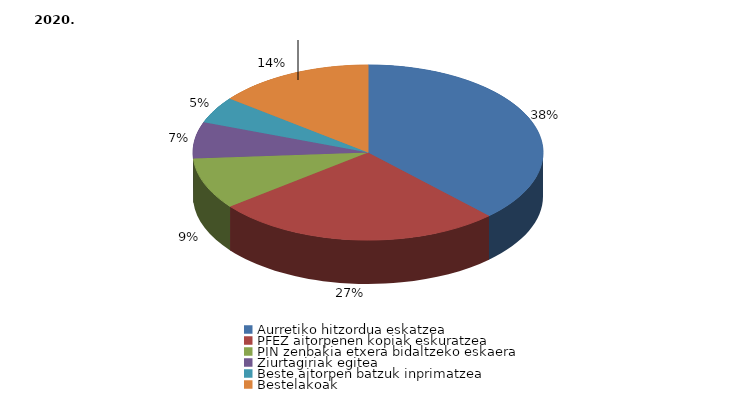
| Category | Series 0 |
|---|---|
| Aurretiko hitzordua eskatzea | 332 |
| PFEZ aitorpenen kopiak eskuratzea | 233 |
| PIN zenbakia etxera bidaltzeko eskaera | 83 |
| Ziurtagiriak egitea | 59 |
| Beste aitorpen batzuk inprimatzea | 43 |
| Bestelakoak | 127 |